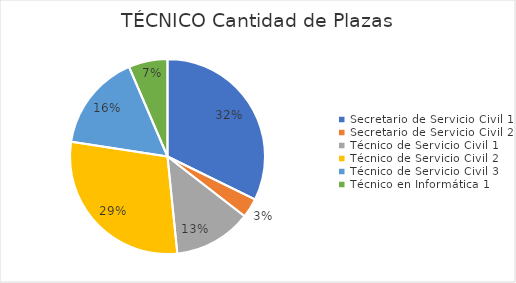
| Category | TÉCNICO |
|---|---|
| Secretario de Servicio Civil 1 | 10 |
| Secretario de Servicio Civil 2 | 1 |
| Técnico de Servicio Civil 1 | 4 |
| Técnico de Servicio Civil 2 | 9 |
| Técnico de Servicio Civil 3 | 5 |
| Técnico en Informática 1 | 2 |